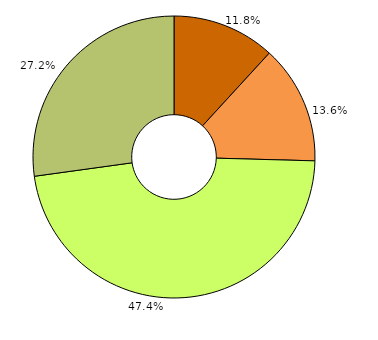
| Category | Series 0 |
|---|---|
| Akute Kindeswohlgefährdung | 365 |
| Latente Kindeswohlgefährdung | 421 |
| Keine Kindeswohlgefährdung, aber Hilfe/ Unterstützungsbedarf | 1464 |
| Keine Kindeswohlgefährdung und kein Hilfebedarf | 840 |